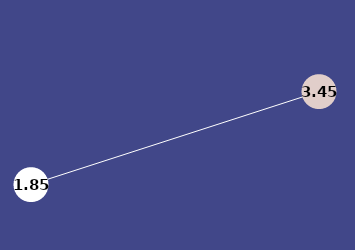
| Category | Series 0 |
|---|---|
| 0 | 1.851 |
| 1 | 3.455 |